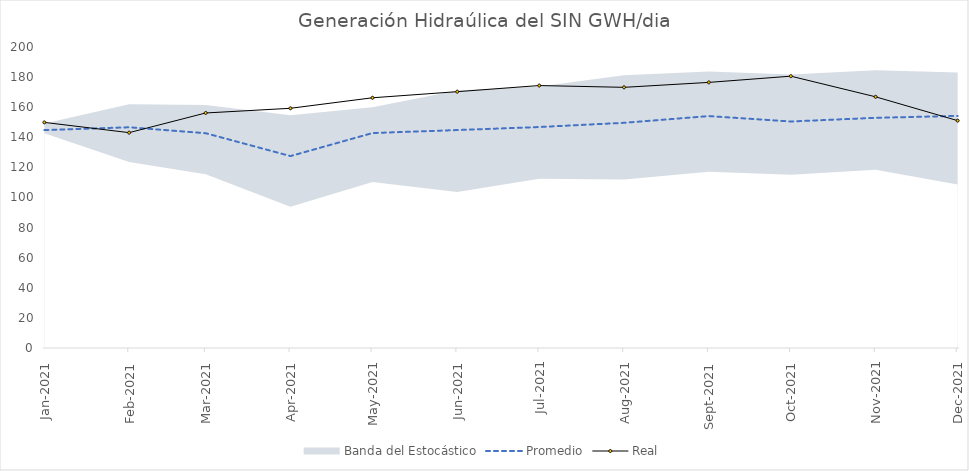
| Category | Promedio | Real |
|---|---|---|
| 2021-01-01 | 144.803 | 149.904 |
| 2021-02-01 | 146.657 | 143.094 |
| 2021-03-01 | 142.716 | 156.161 |
| 2021-04-01 | 127.527 | 159.275 |
| 2021-05-01 | 142.823 | 166.259 |
| 2021-06-01 | 144.817 | 170.322 |
| 2021-07-01 | 146.826 | 174.394 |
| 2021-08-01 | 149.626 | 173.2 |
| 2021-09-01 | 154.097 | 176.485 |
| 2021-10-01 | 150.503 | 180.615 |
| 2021-11-01 | 152.94 | 166.897 |
| 2021-12-01 | 154.216 | 151.08 |